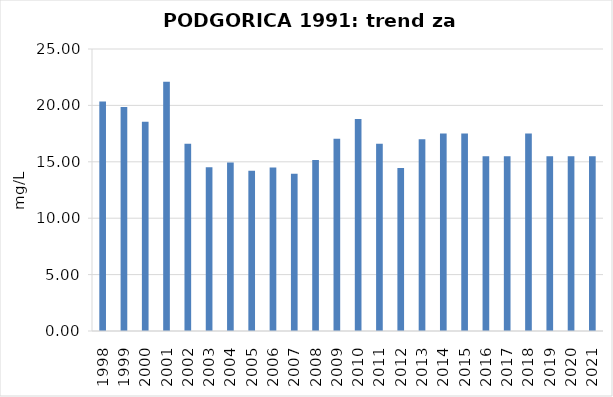
| Category | Vsota |
|---|---|
| 1998 | 20.35 |
| 1999 | 19.85 |
| 2000 | 18.55 |
| 2001 | 22.1 |
| 2002 | 16.6 |
| 2003 | 14.525 |
| 2004 | 14.933 |
| 2005 | 14.2 |
| 2006 | 14.5 |
| 2007 | 13.95 |
| 2008 | 15.15 |
| 2009 | 17.05 |
| 2010 | 18.8 |
| 2011 | 16.6 |
| 2012 | 14.45 |
| 2013 | 17 |
| 2014 | 17.5 |
| 2015 | 17.5 |
| 2016 | 15.5 |
| 2017 | 15.5 |
| 2018 | 17.5 |
| 2019 | 15.5 |
| 2020 | 15.5 |
| 2021 | 15.5 |